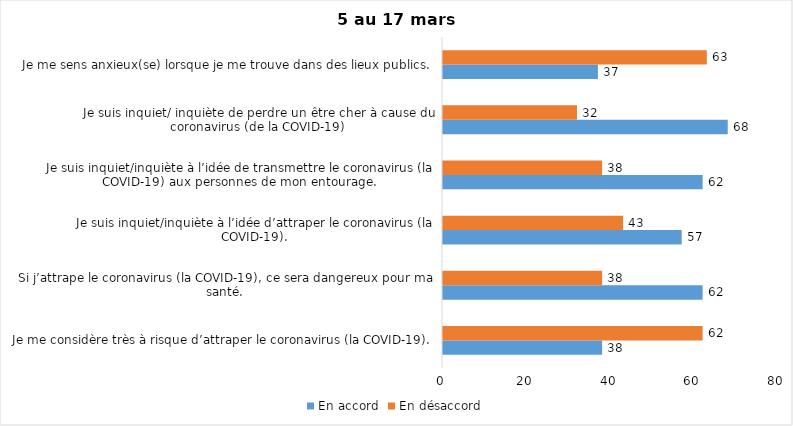
| Category | En accord | En désaccord |
|---|---|---|
| Je me considère très à risque d’attraper le coronavirus (la COVID-19). | 38 | 62 |
| Si j’attrape le coronavirus (la COVID-19), ce sera dangereux pour ma santé. | 62 | 38 |
| Je suis inquiet/inquiète à l’idée d’attraper le coronavirus (la COVID-19). | 57 | 43 |
| Je suis inquiet/inquiète à l’idée de transmettre le coronavirus (la COVID-19) aux personnes de mon entourage. | 62 | 38 |
| Je suis inquiet/ inquiète de perdre un être cher à cause du coronavirus (de la COVID-19) | 68 | 32 |
| Je me sens anxieux(se) lorsque je me trouve dans des lieux publics. | 37 | 63 |